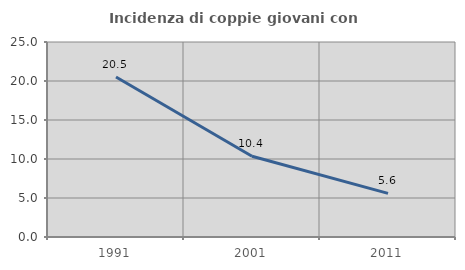
| Category | Incidenza di coppie giovani con figli |
|---|---|
| 1991.0 | 20.519 |
| 2001.0 | 10.357 |
| 2011.0 | 5.598 |